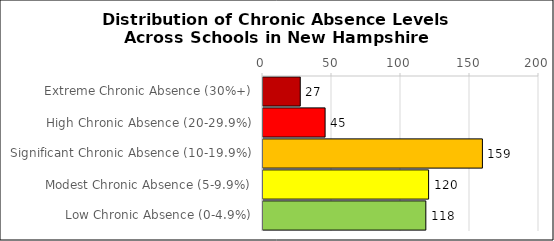
| Category | Number of Schools |
|---|---|
| Extreme Chronic Absence (30%+) | 27 |
| High Chronic Absence (20-29.9%) | 45 |
| Significant Chronic Absence (10-19.9%) | 159 |
| Modest Chronic Absence (5-9.9%) | 120 |
| Low Chronic Absence (0-4.9%) | 118 |